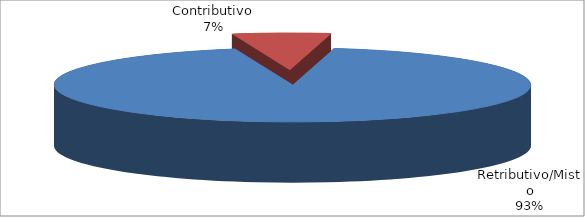
| Category | Decorrenti ANNO 2019 |
|---|---|
| Retributivo/Misto | 304086 |
| Contributivo | 21698 |